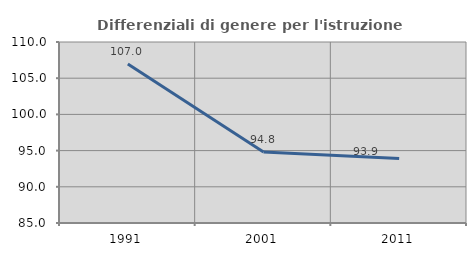
| Category | Differenziali di genere per l'istruzione superiore |
|---|---|
| 1991.0 | 106.96 |
| 2001.0 | 94.821 |
| 2011.0 | 93.917 |